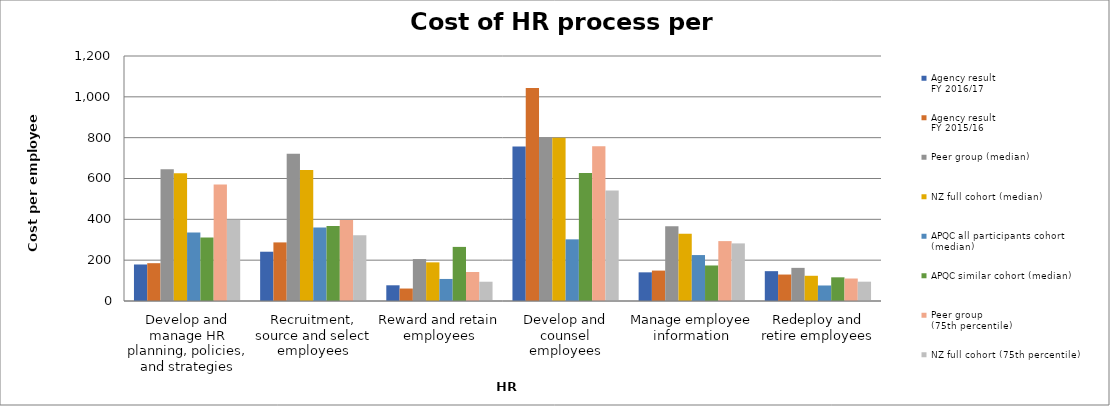
| Category | Agency result
FY 2016/17 | Agency result
FY 2015/16 | Peer group (median) | NZ full cohort (median) | APQC all participants cohort (median) | APQC similar cohort (median) | Peer group 
(75th percentile) | NZ full cohort (75th percentile) |
|---|---|---|---|---|---|---|---|---|
| Develop and manage HR planning, policies, and strategies | 178.846 | 185.204 | 645.475 | 625.104 | 335 | 311 | 570.054 | 398.192 |
| Recruitment, source and select employees | 241.346 | 286.991 | 720.984 | 641.451 | 360 | 367 | 397.181 | 321.626 |
| Reward and retain employees | 76.923 | 61.072 | 205.519 | 189.295 | 108 | 265 | 141.928 | 94.387 |
| Develop and counsel employees | 757.212 | 1043.198 | 799.879 | 799.879 | 302 | 627 | 757.996 | 541.815 |
| Manage employee information | 140.385 | 148.957 | 365.796 | 329.946 | 225 | 174 | 293.332 | 282.151 |
| Redeploy and retire employees | 146.154 | 129.593 | 162.283 | 123.516 | 76 | 116 | 110.121 | 94.69 |